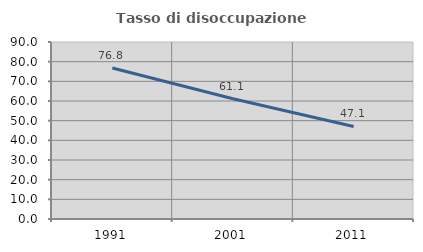
| Category | Tasso di disoccupazione giovanile  |
|---|---|
| 1991.0 | 76.761 |
| 2001.0 | 61.111 |
| 2011.0 | 47.059 |